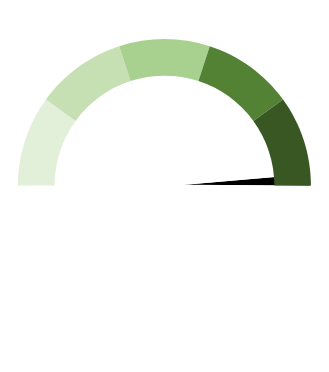
| Category | Series 1 |
|---|---|
| 0 | 98 |
| 1 | 3 |
| 2 | 100.5 |